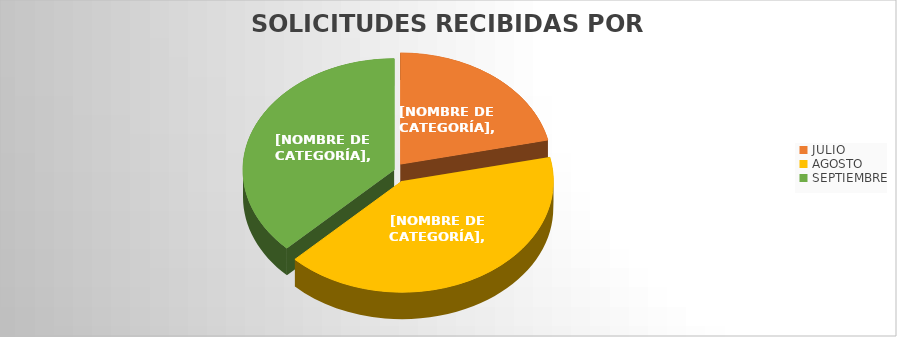
| Category | Series 0 |
|---|---|
| JULIO | 54 |
| AGOSTO | 103 |
| SEPTIEMBRE | 94 |